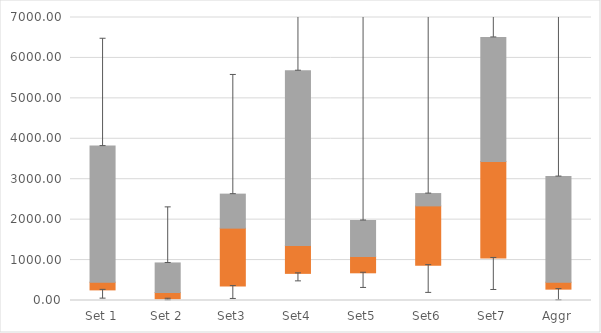
| Category | Q1 | Median-Q1 | Q3-Median |
|---|---|---|---|
| Set 1 | 262.42 | 191.104 | 3366.661 |
| Set 2 | 42.812 | 155.188 | 730.897 |
| Set3 | 356.171 | 1433.594 | 841.4 |
| Set4 | 670.956 | 688.631 | 4324.879 |
| Set5 | 685.072 | 400.176 | 893.907 |
| Set6 | 874.401 | 1465.949 | 304.863 |
| Set7 | 1051.28 | 2386.449 | 3070.217 |
| Aggr | 280.866 | 172.657 | 2613.06 |